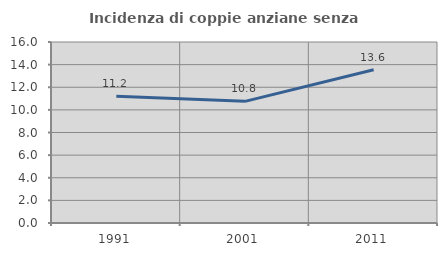
| Category | Incidenza di coppie anziane senza figli  |
|---|---|
| 1991.0 | 11.206 |
| 2001.0 | 10.753 |
| 2011.0 | 13.553 |